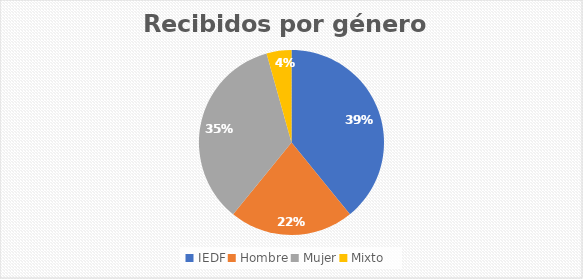
| Category | Recibidos por género  Cantidad |
|---|---|
| IEDF | 9 |
| Hombre | 5 |
| Mujer | 8 |
| Mixto | 1 |